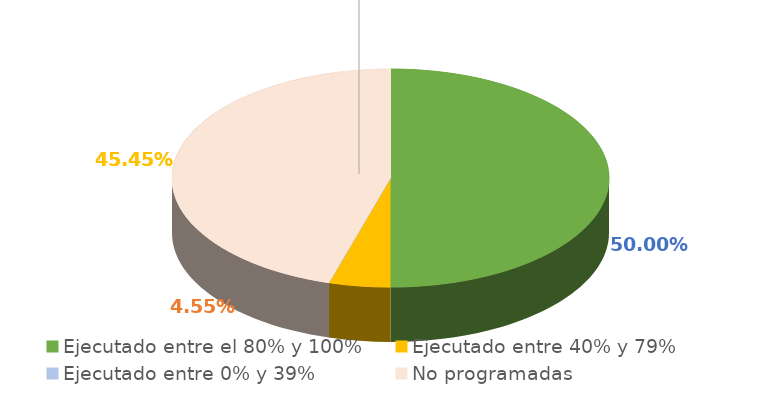
| Category | Series 0 |
|---|---|
| Ejecutado entre el 80% y 100% | 0.5 |
| Ejecutado entre 40% y 79% | 0.045 |
| Ejecutado entre 0% y 39% | 0 |
| No programadas | 0.455 |